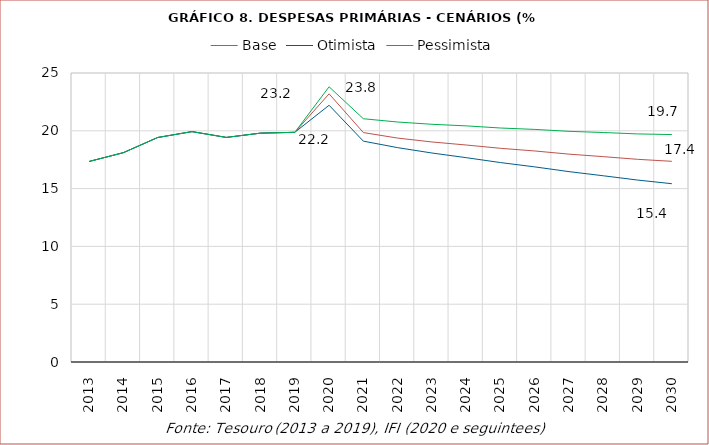
| Category | Base | Otimista | Pessimista |
|---|---|---|---|
| 2013.0 | 17.348 | 17.348 | 17.348 |
| 2014.0 | 18.109 | 18.109 | 18.109 |
| 2015.0 | 19.421 | 19.421 | 19.421 |
| 2016.0 | 19.929 | 19.929 | 19.929 |
| 2017.0 | 19.428 | 19.428 | 19.428 |
| 2018.0 | 19.798 | 19.798 | 19.798 |
| 2019.0 | 19.869 | 19.869 | 19.869 |
| 2020.0 | 23.198 | 22.208 | 23.807 |
| 2021.0 | 19.847 | 19.105 | 21.044 |
| 2022.0 | 19.37 | 18.543 | 20.759 |
| 2023.0 | 19.034 | 18.079 | 20.563 |
| 2024.0 | 18.771 | 17.676 | 20.427 |
| 2025.0 | 18.486 | 17.252 | 20.241 |
| 2026.0 | 18.255 | 16.879 | 20.12 |
| 2027.0 | 17.981 | 16.467 | 19.954 |
| 2028.0 | 17.765 | 16.109 | 19.851 |
| 2029.0 | 17.533 | 15.739 | 19.73 |
| 2030.0 | 17.359 | 15.424 | 19.676 |